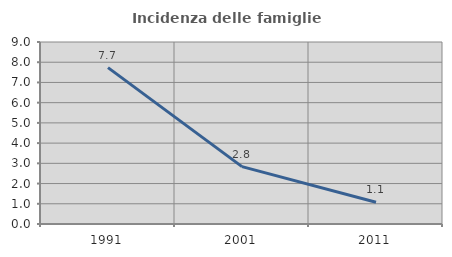
| Category | Incidenza delle famiglie numerose |
|---|---|
| 1991.0 | 7.734 |
| 2001.0 | 2.837 |
| 2011.0 | 1.077 |